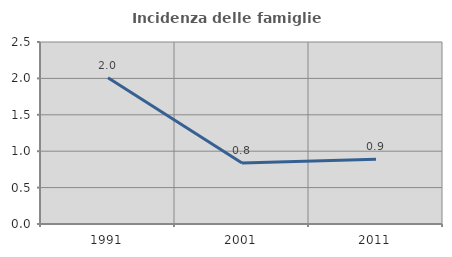
| Category | Incidenza delle famiglie numerose |
|---|---|
| 1991.0 | 2.01 |
| 2001.0 | 0.839 |
| 2011.0 | 0.889 |